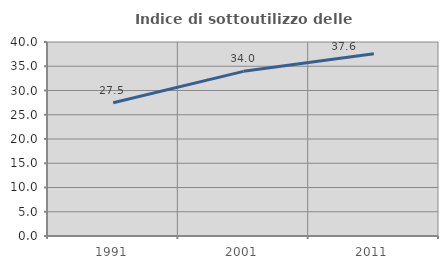
| Category | Indice di sottoutilizzo delle abitazioni  |
|---|---|
| 1991.0 | 27.472 |
| 2001.0 | 33.95 |
| 2011.0 | 37.566 |